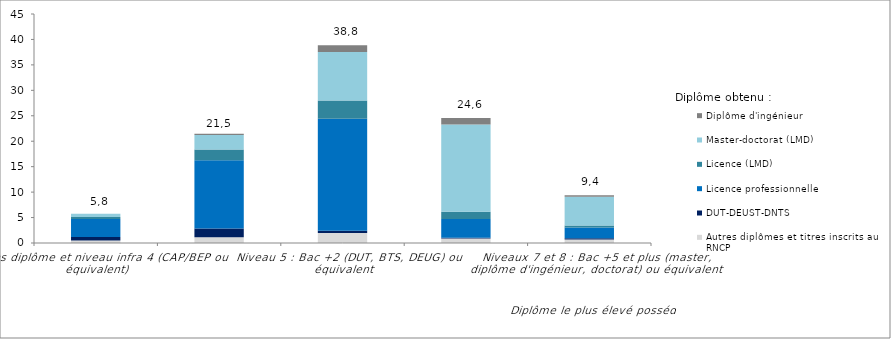
| Category | Autres diplômes et titres inscrits au RNCP | DUT-DEUST-DNTS | Licence professionnelle | Licence (LMD) | Master-doctorat (LMD) | Diplôme d'ingénieur |
|---|---|---|---|---|---|---|
| Sans diplôme et niveau infra 4 (CAP/BEP ou équivalent) | 0.47 | 0.72 | 3.52 | 0.41 | 0.64 | 0 |
| Niveau 4 : Bac, ESEU, DAEU ou équivalent | 1.14 | 1.69 | 13.43 | 2.13 | 2.85 | 0.22 |
| Niveau 5 : Bac +2 (DUT, BTS, DEUG) ou équivalent | 1.97 | 0.42 | 22.02 | 3.6 | 9.53 | 1.3 |
| Niveau 6 : Bac +3-4 (licence, maîtrise) ou équivalent | 0.89 | 0.14 | 3.68 | 1.44 | 17.14 | 1.27 |
| Niveaux 7 et 8 : Bac +5 et plus (master, diplôme d'ingénieur, doctorat) ou équivalent | 0.69 | 0.25 | 2.13 | 0.39 | 5.65 | 0.28 |